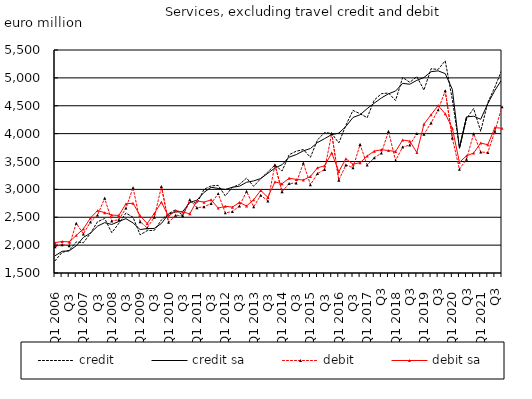
| Category | credit | credit sa | debit | debit sa |
|---|---|---|---|---|
| Q1 2006 | 1718.173 | 1809.078 | 1968.756 | 2044.682 |
| Q2  | 1870.321 | 1888.442 | 2008.812 | 2065.698 |
| Q3  | 1902.637 | 1898.634 | 1989.07 | 2057.556 |
| Q4  | 2057.702 | 1988.598 | 2391.406 | 2175.274 |
| Q1 2007 | 2042.72 | 2138.733 | 2201.165 | 2291.339 |
| Q2  | 2212.756 | 2215.581 | 2414.754 | 2486.838 |
| Q3  | 2419.319 | 2340.392 | 2539.663 | 2619.033 |
| Q4  | 2478.102 | 2402.886 | 2841.774 | 2582.479 |
| Q1 2008 | 2222.619 | 2370.566 | 2434.113 | 2539.033 |
| Q2  | 2391.591 | 2424.399 | 2455.361 | 2533.173 |
| Q3  | 2574.996 | 2474.845 | 2664.82 | 2741.591 |
| Q4  | 2499.047 | 2398.266 | 3030.298 | 2751.414 |
| Q1 2009 | 2184.826 | 2279.096 | 2419.256 | 2526.895 |
| Q2  | 2259.709 | 2297.277 | 2310.871 | 2386.219 |
| Q3  | 2264.704 | 2299.272 | 2501.026 | 2569.307 |
| Q4  | 2452.803 | 2389.101 | 3051.437 | 2771.619 |
| Q1 2010 | 2563.956 | 2556.392 | 2408.201 | 2517.189 |
| Q2  | 2634.038 | 2595.255 | 2536.305 | 2617.602 |
| Q3  | 2534.149 | 2601.388 | 2527.816 | 2593.43 |
| Q4  | 2784.178 | 2764.899 | 2816.559 | 2562.856 |
| Q1 2011 | 2748.976 | 2805.487 | 2671.984 | 2793.737 |
| Q2  | 3000.015 | 2946.232 | 2686.607 | 2770.96 |
| Q3  | 3062.525 | 3037.431 | 2745.638 | 2812.803 |
| Q4  | 3071.666 | 3016.813 | 2924.534 | 2664.422 |
| Q1 2012 | 2883.54 | 2998.238 | 2578.506 | 2697.996 |
| Q2  | 3035.954 | 3037.676 | 2600.958 | 2681.44 |
| Q3  | 3090.286 | 3056.751 | 2702.74 | 2766.065 |
| Q4  | 3202.745 | 3127.734 | 2964.437 | 2702.35 |
| Q1 2013 | 3054.566 | 3151.817 | 2687.488 | 2814.182 |
| Q2  | 3194.352 | 3194.253 | 2893.455 | 2981.727 |
| Q3  | 3313.942 | 3288.764 | 2792.872 | 2856.243 |
| Q4  | 3436.896 | 3384.082 | 3438.387 | 3135.173 |
| Q1 2014 | 3328.502 | 3442.305 | 2959.569 | 3101.304 |
| Q2  | 3622.26 | 3578.096 | 3105.977 | 3201.156 |
| Q3  | 3684.132 | 3623.634 | 3112.511 | 3178.585 |
| Q4  | 3714.399 | 3690.385 | 3471.867 | 3167.571 |
| Q1 2015 | 3575.173 | 3733.147 | 3083.004 | 3232.574 |
| Q2  | 3887.639 | 3840.666 | 3285.309 | 3387.878 |
| Q3  | 4021.146 | 3910.137 | 3356.506 | 3422.253 |
| Q4 | 4003.722 | 3982.536 | 4003.473 | 3654.544 |
| Q1 2016 | 3832.656 | 4008.707 | 3164.529 | 3318.427 |
| Q2  | 4151.781 | 4127.528 | 3437.995 | 3548.292 |
| Q3  | 4416.246 | 4290.558 | 3389.977 | 3450.601 |
| Q4 | 4357.124 | 4338.204 | 3806.082 | 3479.169 |
| Q1 2017 | 4287.01 | 4449.677 | 3435.131 | 3599.339 |
| Q2  | 4601.797 | 4546.335 | 3567.005 | 3686.044 |
| Q3 | 4715.777 | 4639.738 | 3651.356 | 3709.655 |
| Q4 | 4728.814 | 4713.684 | 4040.258 | 3698.032 |
| Q1 2018 | 4594.023 | 4763.851 | 3517.83 | 3679.981 |
| Q2  | 5006.797 | 4901.497 | 3759.762 | 3886.181 |
| Q3 | 4920.841 | 4885.692 | 3795.63 | 3865.276 |
| Q4 | 5023.068 | 4956.656 | 4003.603 | 3660.335 |
| Q1 2019 | 4780.684 | 5006.411 | 3990.272 | 4170.38 |
| Q2  | 5163.398 | 5110.959 | 4191.248 | 4340.251 |
| Q3 | 5151.944 | 5126.145 | 4426.287 | 4503.224 |
| Q4 | 5306.778 | 5076.203 | 4767.785 | 4356.712 |
| Q1 2020 | 4610.038 | 4793.993 | 3923.28 | 4097.069 |
| Q2  | 3749.059 | 3738.333 | 3359.241 | 3485.211 |
| Q3 | 4267.075 | 4299.368 | 3541.084 | 3601.246 |
| Q4 | 4450.865 | 4312.18 | 3997.074 | 3651.497 |
| Q1 2021 | 4043.121 | 4257.304 | 3671.1 | 3832.33 |
| Q2  | 4559.546 | 4536.947 | 3660.393 | 3800.163 |
| Q3 | 4836.595 | 4775.533 | 4041.53 | 4108.507 |
| Q4 | 5150.185 | 4975.547 | 4483.586 | 4095.464 |